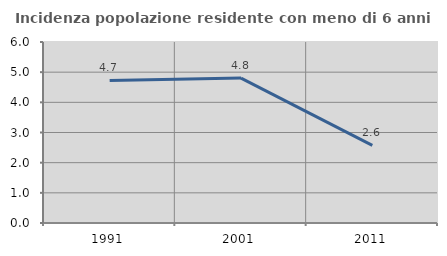
| Category | Incidenza popolazione residente con meno di 6 anni |
|---|---|
| 1991.0 | 4.727 |
| 2001.0 | 4.804 |
| 2011.0 | 2.574 |